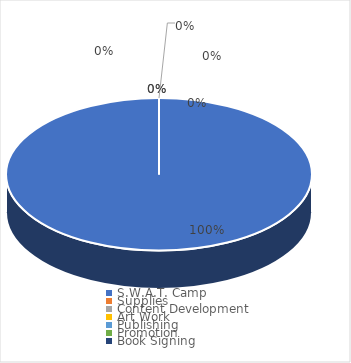
| Category | $299.00  |
|---|---|
| S.W.A.T. Camp | 299 |
| Supplies | 0 |
| Content Development | 0 |
| Art Work | 0 |
| Publishing | 0 |
| Promotion | 0 |
| Book Signing | 0 |